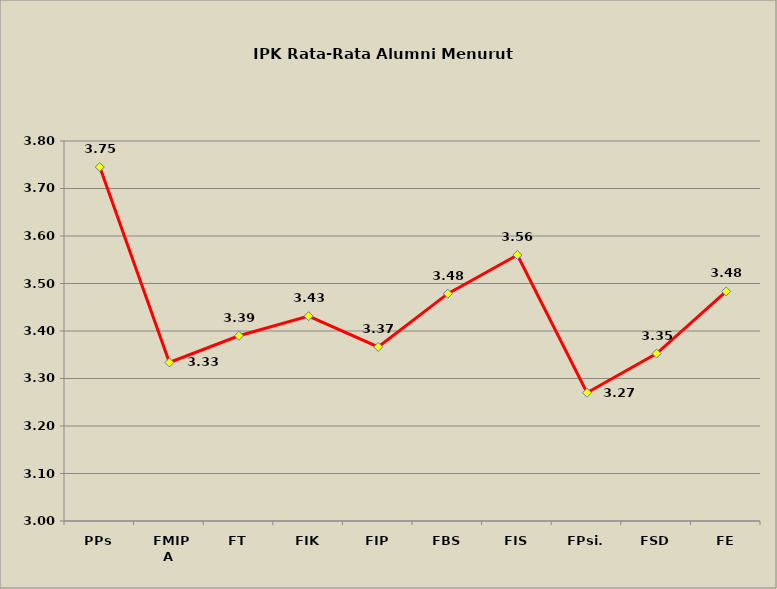
| Category | Series 0 |
|---|---|
|  PPs | 3.745 |
|  FMIPA | 3.334 |
|  FT | 3.39 |
|  FIK | 3.431 |
|  FIP | 3.366 |
|  FBS | 3.479 |
|  FIS | 3.56 |
|  FPsi. | 3.27 |
|  FSD | 3.352 |
|  FE | 3.483 |